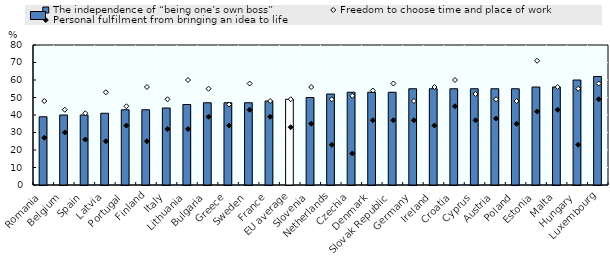
| Category | The independence of “being one’s own boss” |
|---|---|
| Romania | 39 |
| Belgium | 40 |
| Spain | 40 |
| Latvia | 41 |
| Portugal | 43 |
| Finland | 43 |
| Italy | 44 |
| Lithuania | 46 |
| Bulgaria | 47 |
| Greece | 47 |
| Sweden | 47 |
| France | 48 |
| EU average | 49 |
| Slovenia | 50 |
| Netherlands | 52 |
| Czechia | 53 |
| Denmark | 53 |
| Slovak Republic | 53 |
| Germany | 55 |
| Ireland | 55 |
| Croatia | 55 |
| Cyprus | 55 |
| Austria | 55 |
| Poland | 55 |
| Estonia | 56 |
| Malta | 56 |
| Hungary | 60 |
| Luxembourg | 62 |